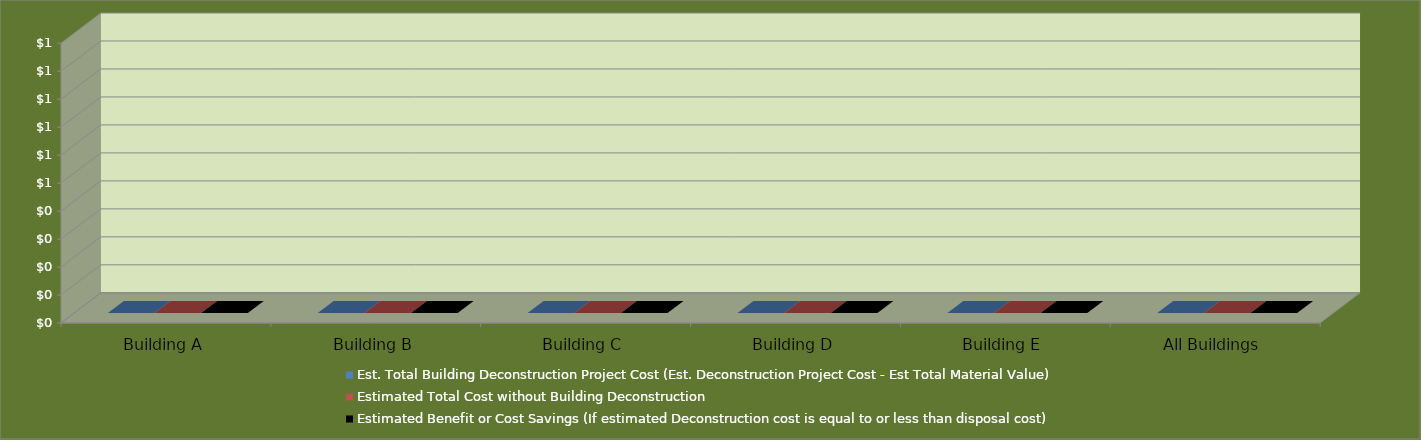
| Category | Est. Total Building Deconstruction Project Cost (Est. Deconstruction Project Cost - Est Total Material Value) | Estimated Total Cost without Building Deconstruction | Estimated Benefit or Cost Savings (If estimated Deconstruction cost is equal to or less than disposal cost) |
|---|---|---|---|
| Building A | 0 | 0 | 0 |
| Building B | 0 | 0 | 0 |
| Building C | 0 | 0 | 0 |
| Building D | 0 | 0 | 0 |
| Building E | 0 | 0 | 0 |
| All Buildings | 0 | 0 | 0 |